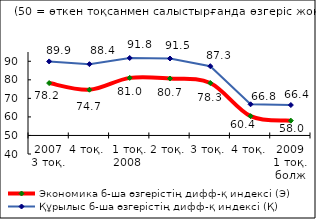
| Category | Экономика б-ша өзгерістің дифф-қ индексі (Э) | Құрылыс б-ша өзгерістің дифф-қ индексі (Қ) |
|---|---|---|
| 2007 3 тоқ. | 78.235 | 89.915 |
| 4 тоқ. | 74.655 | 88.445 |
| 1 тоқ. 2008  | 81.045 | 91.77 |
| 2 тоқ. | 80.69 | 91.49 |
| 3 тоқ. | 78.275 | 87.345 |
| 4 тоқ.  | 60.405 | 66.8 |
| 2009 1 тоқ. болж | 57.98 | 66.4 |